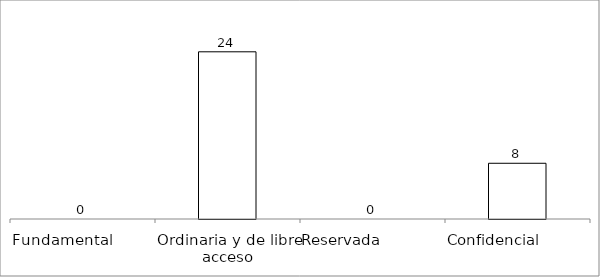
| Category | Series 0 |
|---|---|
| Fundamental         | 0 |
| Ordinaria y de libre acceso | 24 |
| Reservada               | 0 |
| Confidencial             | 8 |